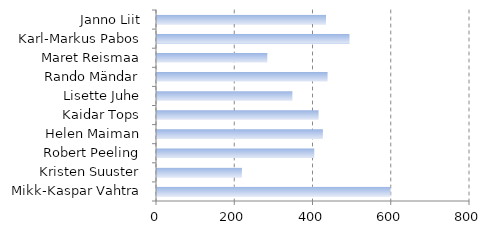
| Category | Series 0 |
|---|---|
| Mikk-Kaspar Vahtra | 597 |
| Kristen Suuster | 217 |
| Robert Peeling | 402 |
| Helen Maiman | 424 |
| Kaidar Tops | 413 |
| Lisette Juhe | 346 |
| Rando Mändar | 436 |
| Maret Reismaa | 282 |
| Karl-Markus Pabos | 492 |
| Janno Liit | 432 |